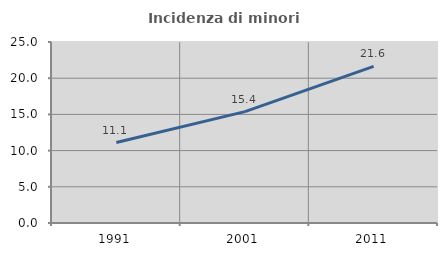
| Category | Incidenza di minori stranieri |
|---|---|
| 1991.0 | 11.111 |
| 2001.0 | 15.385 |
| 2011.0 | 21.622 |